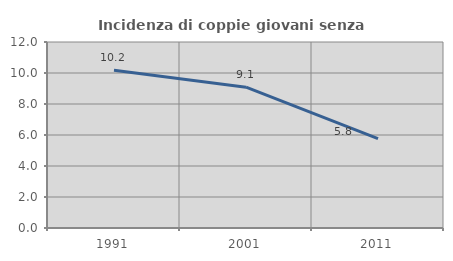
| Category | Incidenza di coppie giovani senza figli |
|---|---|
| 1991.0 | 10.172 |
| 2001.0 | 9.085 |
| 2011.0 | 5.768 |